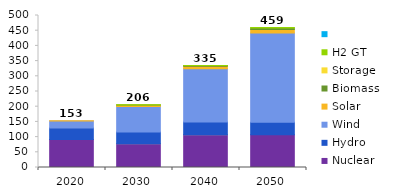
| Category | Nuclear | CH4 GT | Hydro | Wind | Solar | Biomass | Storage | H2 GT | Series 8 | Series 9 |
|---|---|---|---|---|---|---|---|---|---|---|
| 2020.0 | 91.728 | 0 | 38.412 | 22.581 | 0.661 | 0 | -0.048 | 0 |  | 153.334 |
| 2030.0 | 77.781 | 0.146 | 38.483 | 84.302 | 5.054 | 0.013 | -0.366 | 0.535 |  | 205.948 |
| 2040.0 | 107.65 | 0.088 | 41.598 | 175.104 | 8.232 | 2.472 | -0.816 | 0.524 |  | 334.853 |
| 2050.0 | 107.361 | 0 | 41.598 | 293.472 | 11.748 | 4.924 | -1.087 | 1.343 |  | 459.359 |